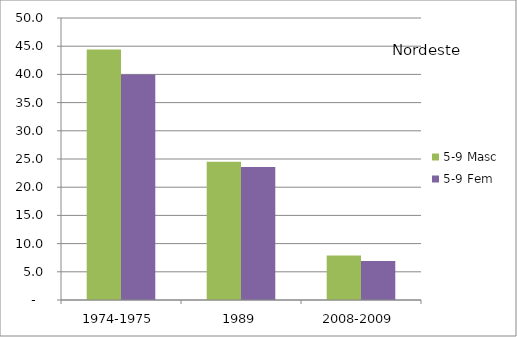
| Category | 5-9 Masc | 5-9 Fem |
|---|---|---|
| 1974-1975 | 44.4 | 40 |
| 1989 | 24.5 | 23.6 |
| 2008-2009 | 7.9 | 6.9 |